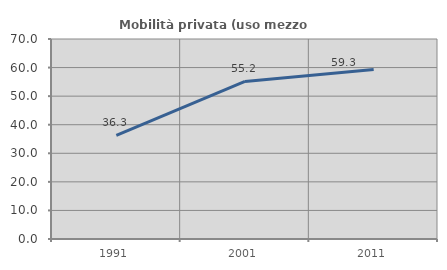
| Category | Mobilità privata (uso mezzo privato) |
|---|---|
| 1991.0 | 36.289 |
| 2001.0 | 55.165 |
| 2011.0 | 59.308 |